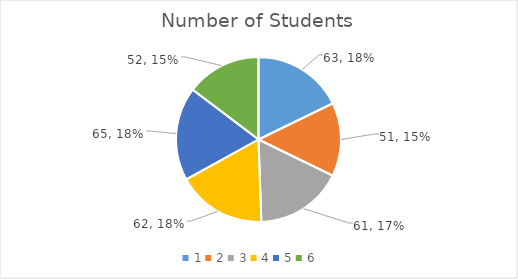
| Category | Number of Students |
|---|---|
| 0 | 63 |
| 1 | 51 |
| 2 | 61 |
| 3 | 62 |
| 4 | 65 |
| 5 | 52 |